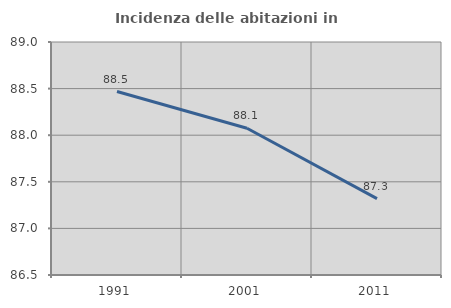
| Category | Incidenza delle abitazioni in proprietà  |
|---|---|
| 1991.0 | 88.469 |
| 2001.0 | 88.075 |
| 2011.0 | 87.32 |